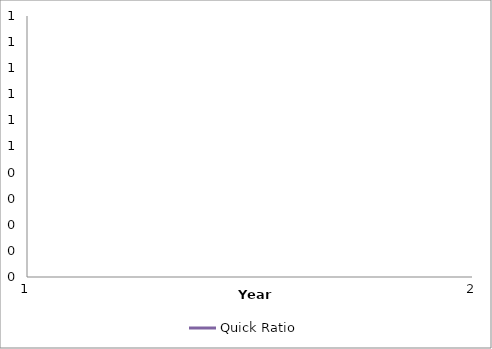
| Category | Quick Ratio |
|---|---|
| 0 | 0 |
| 1 | 0 |
| 2 | 0 |
| 3 | 0 |
| 4 | 0 |
| 5 | 0 |
| 6 | 0 |
| 7 | 0 |
| 8 | 0 |
| 9 | 0 |